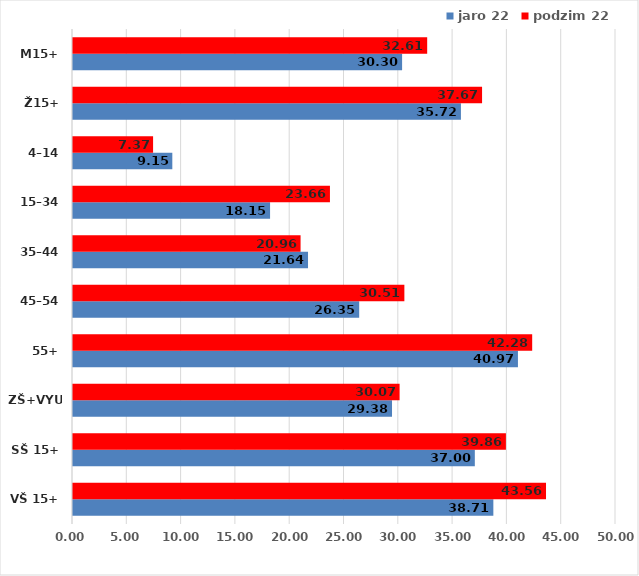
| Category | jaro 22 | podzim 22 |
|---|---|---|
| VŠ 15+ | 38.706 | 43.556 |
| SŠ 15+ | 37.001 | 39.863 |
| ZŠ+VYUČ | 29.375 | 30.073 |
| 55+ | 40.971 | 42.283 |
| 45–54 | 26.353 | 30.513 |
| 35–44 | 21.641 | 20.955 |
| 15–34 | 18.147 | 23.659 |
| 4–14 | 9.146 | 7.374 |
| Ž15+ | 35.721 | 37.667 |
| M15+ | 30.304 | 32.614 |